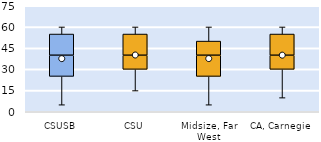
| Category | 25th | 50th | 75th |
|---|---|---|---|
| CSUSB | 25 | 15 | 15 |
| CSU | 30 | 10 | 15 |
| Midsize, Far West | 25 | 15 | 10 |
| CA, Carnegie | 30 | 10 | 15 |